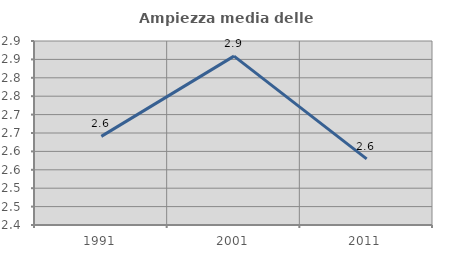
| Category | Ampiezza media delle famiglie |
|---|---|
| 1991.0 | 2.641 |
| 2001.0 | 2.859 |
| 2011.0 | 2.58 |